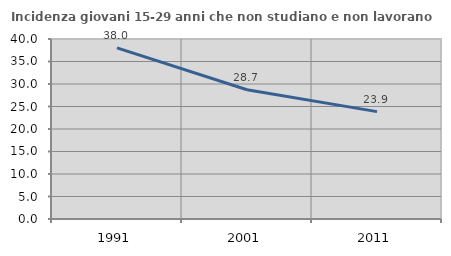
| Category | Incidenza giovani 15-29 anni che non studiano e non lavorano  |
|---|---|
| 1991.0 | 38.033 |
| 2001.0 | 28.729 |
| 2011.0 | 23.857 |